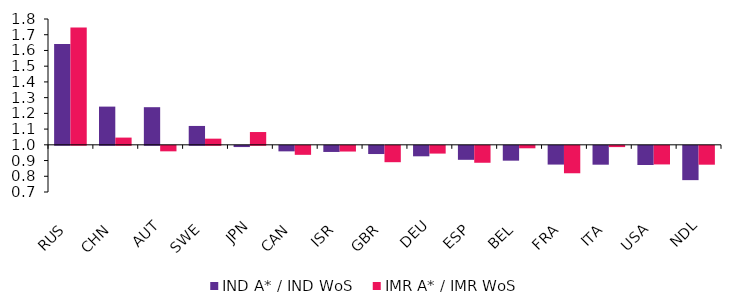
| Category | IND A* / IND WoS  | IMR A* / IMR WoS |
|---|---|---|
| RUS | 1.641 | 1.745 |
| CHN | 1.243 | 1.046 |
| AUT | 1.239 | 0.965 |
| SWE | 1.12 | 1.039 |
| JPN | 0.992 | 1.081 |
| CAN | 0.965 | 0.943 |
| ISR | 0.961 | 0.964 |
| GBR | 0.948 | 0.896 |
| DEU | 0.933 | 0.951 |
| ESP | 0.911 | 0.892 |
| BEL | 0.906 | 0.984 |
| FRA | 0.881 | 0.825 |
| ITA | 0.88 | 0.992 |
| USA | 0.878 | 0.882 |
| NDL | 0.782 | 0.88 |